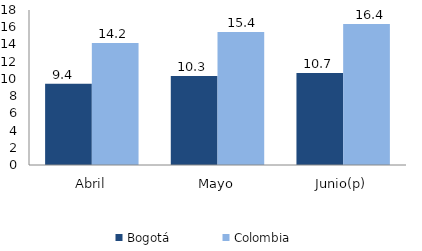
| Category | Bogotá | Colombia |
|---|---|---|
| Abril | 9.442 | 14.16 |
| Mayo | 10.327 | 15.442 |
| Junio(p) | 10.68 | 16.378 |